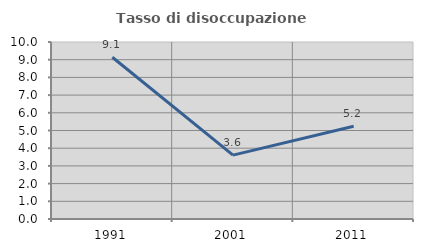
| Category | Tasso di disoccupazione giovanile  |
|---|---|
| 1991.0 | 9.137 |
| 2001.0 | 3.61 |
| 2011.0 | 5.236 |